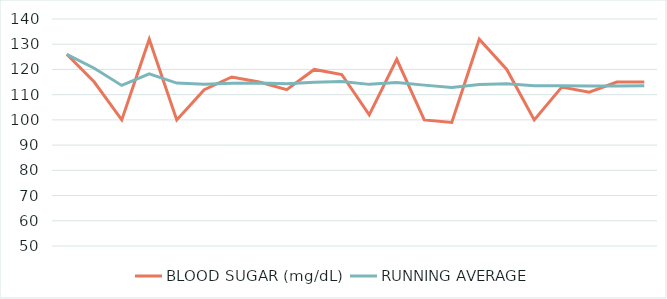
| Category | BLOOD SUGAR (mg/dL) | RUNNING AVERAGE |
|---|---|---|
| 0 | 126 | 126 |
| 1 | 115 | 120.5 |
| 2 | 100 | 113.667 |
| 3 | 132 | 118.25 |
| 4 | 100 | 114.6 |
| 5 | 112 | 114.167 |
| 6 | 117 | 114.571 |
| 7 | 115 | 114.625 |
| 8 | 112 | 114.333 |
| 9 | 120 | 114.9 |
| 10 | 118 | 115.182 |
| 11 | 102 | 114.083 |
| 12 | 124 | 114.846 |
| 13 | 100 | 113.786 |
| 14 | 99 | 112.8 |
| 15 | 132 | 114 |
| 16 | 120 | 114.353 |
| 17 | 100 | 113.556 |
| 18 | 113 | 113.526 |
| 19 | 111 | 113.4 |
| 20 | 115 | 113.476 |
| 21 | 115 | 113.545 |